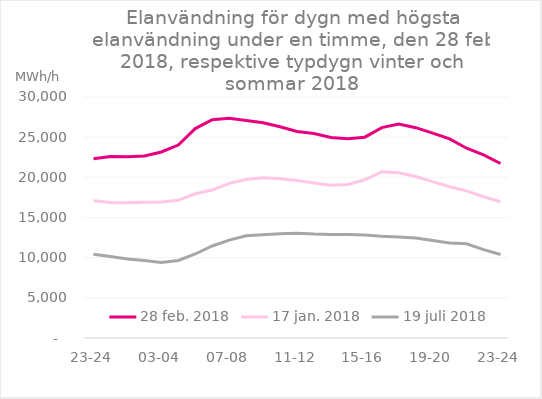
| Category | 28 feb 2018 | 17 jan 2018 | 19 jul 2018 |
|---|---|---|---|
| 23-24 | 22324 | 17092 | 10430 |
| 00-01 | 22596 | 16862 | 10154 |
| 01-02 | 22548 | 16834 | 9829 |
| 02-03 | 22654 | 16903 | 9658 |
| 03-04 | 23154 | 16924 | 9414 |
| 04-05 | 24020 | 17154 | 9648 |
| 05-06 | 26068 | 17958 | 10458 |
| 06-07 | 27166 | 18414 | 11452 |
| 07-08 | 27354 | 19244 | 12189 |
| 08-09 | 27070 | 19731 | 12721 |
| 09-10 | 26798 | 19958 | 12852 |
| 10-11 | 26296 | 19826 | 12972 |
| 11-12 | 25714 | 19615 | 13054 |
| 12-13 | 25458 | 19301 | 12949 |
| 13-14 | 24965 | 19012 | 12892 |
| 14-15 | 24818 | 19108 | 12892 |
| 15-16 | 25000 | 19698 | 12822 |
| 16-17 | 26192 | 20706 | 12652 |
| 17-18 | 26620 | 20569 | 12560 |
| 18-19 | 26180 | 20100 | 12459 |
| 19-20 | 25509 | 19468 | 12126 |
| 20-21 | 24778 | 18828 | 11814 |
| 21-22 | 23625 | 18318 | 11730 |
| 22-23 | 22790 | 17580 | 10998 |
| 23-24 | 21722 | 16967 | 10390 |